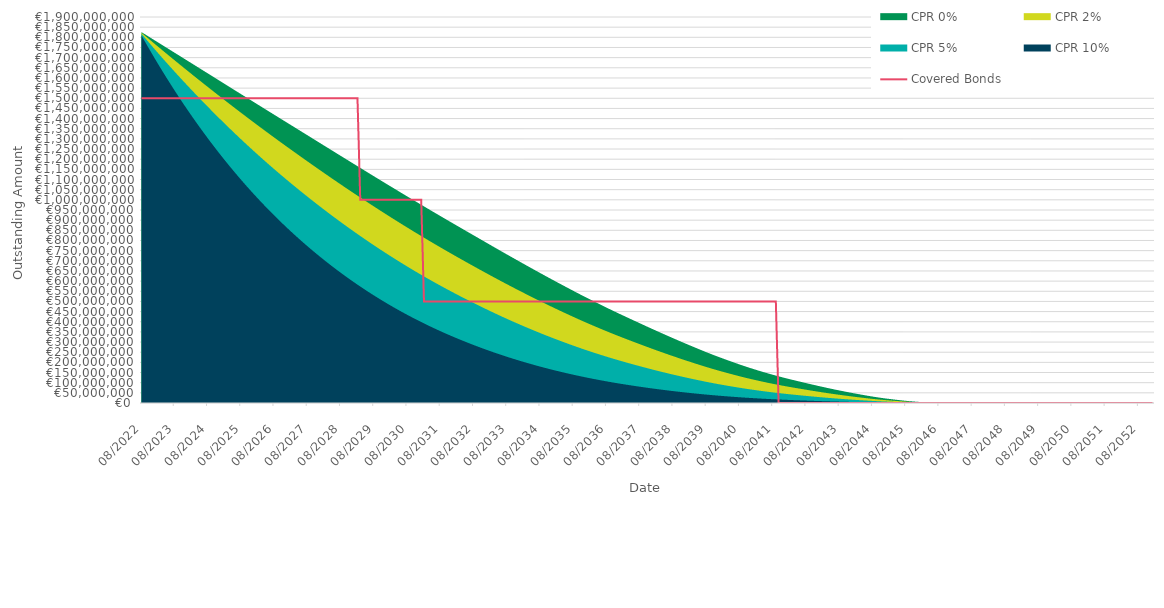
| Category | Covered Bonds |
|---|---|
| 2022-08-31 | 1500000000 |
| 2022-09-30 | 1500000000 |
| 2022-10-31 | 1500000000 |
| 2022-11-30 | 1500000000 |
| 2022-12-31 | 1500000000 |
| 2023-01-31 | 1500000000 |
| 2023-02-28 | 1500000000 |
| 2023-03-31 | 1500000000 |
| 2023-04-30 | 1500000000 |
| 2023-05-31 | 1500000000 |
| 2023-06-30 | 1500000000 |
| 2023-07-31 | 1500000000 |
| 2023-08-31 | 1500000000 |
| 2023-09-30 | 1500000000 |
| 2023-10-31 | 1500000000 |
| 2023-11-30 | 1500000000 |
| 2023-12-31 | 1500000000 |
| 2024-01-31 | 1500000000 |
| 2024-02-29 | 1500000000 |
| 2024-03-31 | 1500000000 |
| 2024-04-30 | 1500000000 |
| 2024-05-31 | 1500000000 |
| 2024-06-30 | 1500000000 |
| 2024-07-31 | 1500000000 |
| 2024-08-31 | 1500000000 |
| 2024-09-30 | 1500000000 |
| 2024-10-31 | 1500000000 |
| 2024-11-30 | 1500000000 |
| 2024-12-31 | 1500000000 |
| 2025-01-31 | 1500000000 |
| 2025-02-28 | 1500000000 |
| 2025-03-31 | 1500000000 |
| 2025-04-30 | 1500000000 |
| 2025-05-31 | 1500000000 |
| 2025-06-30 | 1500000000 |
| 2025-07-31 | 1500000000 |
| 2025-08-31 | 1500000000 |
| 2025-09-30 | 1500000000 |
| 2025-10-31 | 1500000000 |
| 2025-11-30 | 1500000000 |
| 2025-12-31 | 1500000000 |
| 2026-01-31 | 1500000000 |
| 2026-02-28 | 1500000000 |
| 2026-03-31 | 1500000000 |
| 2026-04-30 | 1500000000 |
| 2026-05-31 | 1500000000 |
| 2026-06-30 | 1500000000 |
| 2026-07-31 | 1500000000 |
| 2026-08-31 | 1500000000 |
| 2026-09-30 | 1500000000 |
| 2026-10-31 | 1500000000 |
| 2026-11-30 | 1500000000 |
| 2026-12-31 | 1500000000 |
| 2027-01-31 | 1500000000 |
| 2027-02-28 | 1500000000 |
| 2027-03-31 | 1500000000 |
| 2027-04-30 | 1500000000 |
| 2027-05-31 | 1500000000 |
| 2027-06-30 | 1500000000 |
| 2027-07-31 | 1500000000 |
| 2027-08-31 | 1500000000 |
| 2027-09-30 | 1500000000 |
| 2027-10-31 | 1500000000 |
| 2027-11-30 | 1500000000 |
| 2027-12-31 | 1500000000 |
| 2028-01-31 | 1500000000 |
| 2028-02-29 | 1500000000 |
| 2028-03-31 | 1500000000 |
| 2028-04-30 | 1500000000 |
| 2028-05-31 | 1500000000 |
| 2028-06-30 | 1500000000 |
| 2028-07-31 | 1500000000 |
| 2028-08-31 | 1500000000 |
| 2028-09-30 | 1500000000 |
| 2028-10-31 | 1500000000 |
| 2028-11-30 | 1500000000 |
| 2028-12-31 | 1500000000 |
| 2029-01-31 | 1500000000 |
| 2029-02-28 | 1500000000 |
| 2029-03-31 | 1000000000 |
| 2029-04-30 | 1000000000 |
| 2029-05-31 | 1000000000 |
| 2029-06-30 | 1000000000 |
| 2029-07-31 | 1000000000 |
| 2029-08-31 | 1000000000 |
| 2029-09-30 | 1000000000 |
| 2029-10-31 | 1000000000 |
| 2029-11-30 | 1000000000 |
| 2029-12-31 | 1000000000 |
| 2030-01-31 | 1000000000 |
| 2030-02-28 | 1000000000 |
| 2030-03-31 | 1000000000 |
| 2030-04-30 | 1000000000 |
| 2030-05-31 | 1000000000 |
| 2030-06-30 | 1000000000 |
| 2030-07-31 | 1000000000 |
| 2030-08-31 | 1000000000 |
| 2030-09-30 | 1000000000 |
| 2030-10-31 | 1000000000 |
| 2030-11-30 | 1000000000 |
| 2030-12-31 | 1000000000 |
| 2031-01-31 | 1000000000 |
| 2031-02-28 | 500000000 |
| 2031-03-31 | 500000000 |
| 2031-04-30 | 500000000 |
| 2031-05-31 | 500000000 |
| 2031-06-30 | 500000000 |
| 2031-07-31 | 500000000 |
| 2031-08-31 | 500000000 |
| 2031-09-30 | 500000000 |
| 2031-10-31 | 500000000 |
| 2031-11-30 | 500000000 |
| 2031-12-31 | 500000000 |
| 2032-01-31 | 500000000 |
| 2032-02-29 | 500000000 |
| 2032-03-31 | 500000000 |
| 2032-04-30 | 500000000 |
| 2032-05-31 | 500000000 |
| 2032-06-30 | 500000000 |
| 2032-07-31 | 500000000 |
| 2032-08-31 | 500000000 |
| 2032-09-30 | 500000000 |
| 2032-10-31 | 500000000 |
| 2032-11-30 | 500000000 |
| 2032-12-31 | 500000000 |
| 2033-01-31 | 500000000 |
| 2033-02-28 | 500000000 |
| 2033-03-31 | 500000000 |
| 2033-04-30 | 500000000 |
| 2033-05-31 | 500000000 |
| 2033-06-30 | 500000000 |
| 2033-07-31 | 500000000 |
| 2033-08-31 | 500000000 |
| 2033-09-30 | 500000000 |
| 2033-10-31 | 500000000 |
| 2033-11-30 | 500000000 |
| 2033-12-31 | 500000000 |
| 2034-01-31 | 500000000 |
| 2034-02-28 | 500000000 |
| 2034-03-31 | 500000000 |
| 2034-04-30 | 500000000 |
| 2034-05-31 | 500000000 |
| 2034-06-30 | 500000000 |
| 2034-07-31 | 500000000 |
| 2034-08-31 | 500000000 |
| 2034-09-30 | 500000000 |
| 2034-10-31 | 500000000 |
| 2034-11-30 | 500000000 |
| 2034-12-31 | 500000000 |
| 2035-01-31 | 500000000 |
| 2035-02-28 | 500000000 |
| 2035-03-31 | 500000000 |
| 2035-04-30 | 500000000 |
| 2035-05-31 | 500000000 |
| 2035-06-30 | 500000000 |
| 2035-07-31 | 500000000 |
| 2035-08-31 | 500000000 |
| 2035-09-30 | 500000000 |
| 2035-10-31 | 500000000 |
| 2035-11-30 | 500000000 |
| 2035-12-31 | 500000000 |
| 2036-01-31 | 500000000 |
| 2036-02-29 | 500000000 |
| 2036-03-31 | 500000000 |
| 2036-04-30 | 500000000 |
| 2036-05-31 | 500000000 |
| 2036-06-30 | 500000000 |
| 2036-07-31 | 500000000 |
| 2036-08-31 | 500000000 |
| 2036-09-30 | 500000000 |
| 2036-10-31 | 500000000 |
| 2036-11-30 | 500000000 |
| 2036-12-31 | 500000000 |
| 2037-01-31 | 500000000 |
| 2037-02-28 | 500000000 |
| 2037-03-31 | 500000000 |
| 2037-04-30 | 500000000 |
| 2037-05-31 | 500000000 |
| 2037-06-30 | 500000000 |
| 2037-07-31 | 500000000 |
| 2037-08-31 | 500000000 |
| 2037-09-30 | 500000000 |
| 2037-10-31 | 500000000 |
| 2037-11-30 | 500000000 |
| 2037-12-31 | 500000000 |
| 2038-01-31 | 500000000 |
| 2038-02-28 | 500000000 |
| 2038-03-31 | 500000000 |
| 2038-04-30 | 500000000 |
| 2038-05-31 | 500000000 |
| 2038-06-30 | 500000000 |
| 2038-07-31 | 500000000 |
| 2038-08-31 | 500000000 |
| 2038-09-30 | 500000000 |
| 2038-10-31 | 500000000 |
| 2038-11-30 | 500000000 |
| 2038-12-31 | 500000000 |
| 2039-01-31 | 500000000 |
| 2039-02-28 | 500000000 |
| 2039-03-31 | 500000000 |
| 2039-04-30 | 500000000 |
| 2039-05-31 | 500000000 |
| 2039-06-30 | 500000000 |
| 2039-07-31 | 500000000 |
| 2039-08-31 | 500000000 |
| 2039-09-30 | 500000000 |
| 2039-10-31 | 500000000 |
| 2039-11-30 | 500000000 |
| 2039-12-31 | 500000000 |
| 2040-01-31 | 500000000 |
| 2040-02-29 | 500000000 |
| 2040-03-31 | 500000000 |
| 2040-04-30 | 500000000 |
| 2040-05-31 | 500000000 |
| 2040-06-30 | 500000000 |
| 2040-07-31 | 500000000 |
| 2040-08-31 | 500000000 |
| 2040-09-30 | 500000000 |
| 2040-10-31 | 500000000 |
| 2040-11-30 | 500000000 |
| 2040-12-31 | 500000000 |
| 2041-01-31 | 500000000 |
| 2041-02-28 | 500000000 |
| 2041-03-31 | 500000000 |
| 2041-04-30 | 500000000 |
| 2041-05-31 | 500000000 |
| 2041-06-30 | 500000000 |
| 2041-07-31 | 500000000 |
| 2041-08-31 | 500000000 |
| 2041-09-30 | 500000000 |
| 2041-10-31 | 0 |
| 2041-11-30 | 0 |
| 2041-12-31 | 0 |
| 2042-01-31 | 0 |
| 2042-02-28 | 0 |
| 2042-03-31 | 0 |
| 2042-04-30 | 0 |
| 2042-05-31 | 0 |
| 2042-06-30 | 0 |
| 2042-07-31 | 0 |
| 2042-08-31 | 0 |
| 2042-09-30 | 0 |
| 2042-10-31 | 0 |
| 2042-11-30 | 0 |
| 2042-12-31 | 0 |
| 2043-01-31 | 0 |
| 2043-02-28 | 0 |
| 2043-03-31 | 0 |
| 2043-04-30 | 0 |
| 2043-05-31 | 0 |
| 2043-06-30 | 0 |
| 2043-07-31 | 0 |
| 2043-08-31 | 0 |
| 2043-09-30 | 0 |
| 2043-10-31 | 0 |
| 2043-11-30 | 0 |
| 2043-12-31 | 0 |
| 2044-01-31 | 0 |
| 2044-02-29 | 0 |
| 2044-03-31 | 0 |
| 2044-04-30 | 0 |
| 2044-05-31 | 0 |
| 2044-06-30 | 0 |
| 2044-07-31 | 0 |
| 2044-08-31 | 0 |
| 2044-09-30 | 0 |
| 2044-10-31 | 0 |
| 2044-11-30 | 0 |
| 2044-12-31 | 0 |
| 2045-01-31 | 0 |
| 2045-02-28 | 0 |
| 2045-03-31 | 0 |
| 2045-04-30 | 0 |
| 2045-05-31 | 0 |
| 2045-06-30 | 0 |
| 2045-07-31 | 0 |
| 2045-08-31 | 0 |
| 2045-09-30 | 0 |
| 2045-10-31 | 0 |
| 2045-11-30 | 0 |
| 2045-12-31 | 0 |
| 2046-01-31 | 0 |
| 2046-02-28 | 0 |
| 2046-03-31 | 0 |
| 2046-04-30 | 0 |
| 2046-05-31 | 0 |
| 2046-06-30 | 0 |
| 2046-07-31 | 0 |
| 2046-08-31 | 0 |
| 2046-09-30 | 0 |
| 2046-10-31 | 0 |
| 2046-11-30 | 0 |
| 2046-12-31 | 0 |
| 2047-01-31 | 0 |
| 2047-02-28 | 0 |
| 2047-03-31 | 0 |
| 2047-04-30 | 0 |
| 2047-05-31 | 0 |
| 2047-06-30 | 0 |
| 2047-07-31 | 0 |
| 2047-08-31 | 0 |
| 2047-09-30 | 0 |
| 2047-10-31 | 0 |
| 2047-11-30 | 0 |
| 2047-12-31 | 0 |
| 2048-01-31 | 0 |
| 2048-02-29 | 0 |
| 2048-03-31 | 0 |
| 2048-04-30 | 0 |
| 2048-05-31 | 0 |
| 2048-06-30 | 0 |
| 2048-07-31 | 0 |
| 2048-08-31 | 0 |
| 2048-09-30 | 0 |
| 2048-10-31 | 0 |
| 2048-11-30 | 0 |
| 2048-12-31 | 0 |
| 2049-01-31 | 0 |
| 2049-02-28 | 0 |
| 2049-03-31 | 0 |
| 2049-04-30 | 0 |
| 2049-05-31 | 0 |
| 2049-06-30 | 0 |
| 2049-07-31 | 0 |
| 2049-08-31 | 0 |
| 2049-09-30 | 0 |
| 2049-10-31 | 0 |
| 2049-11-30 | 0 |
| 2049-12-31 | 0 |
| 2050-01-31 | 0 |
| 2050-02-28 | 0 |
| 2050-03-31 | 0 |
| 2050-04-30 | 0 |
| 2050-05-31 | 0 |
| 2050-06-30 | 0 |
| 2050-07-31 | 0 |
| 2050-08-31 | 0 |
| 2050-09-30 | 0 |
| 2050-10-31 | 0 |
| 2050-11-30 | 0 |
| 2050-12-31 | 0 |
| 2051-01-31 | 0 |
| 2051-02-28 | 0 |
| 2051-03-31 | 0 |
| 2051-04-30 | 0 |
| 2051-05-31 | 0 |
| 2051-06-30 | 0 |
| 2051-07-31 | 0 |
| 2051-08-31 | 0 |
| 2051-09-30 | 0 |
| 2051-10-31 | 0 |
| 2051-11-30 | 0 |
| 2051-12-31 | 0 |
| 2052-01-31 | 0 |
| 2052-02-29 | 0 |
| 2052-03-31 | 0 |
| 2052-04-30 | 0 |
| 2052-05-31 | 0 |
| 2052-06-30 | 0 |
| 2052-07-31 | 0 |
| 2052-08-31 | 0 |
| 2052-09-30 | 0 |
| 2052-10-31 | 0 |
| 2052-11-30 | 0 |
| 2052-12-31 | 0 |
| 2053-01-31 | 0 |